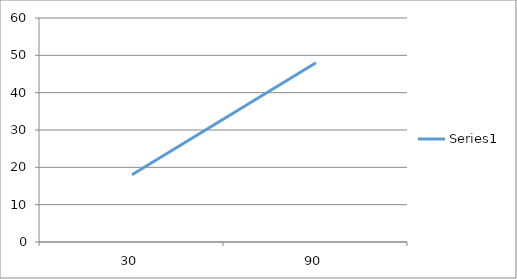
| Category | Series 0 |
|---|---|
| 30.0 | 18 |
| 90.0 | 48 |